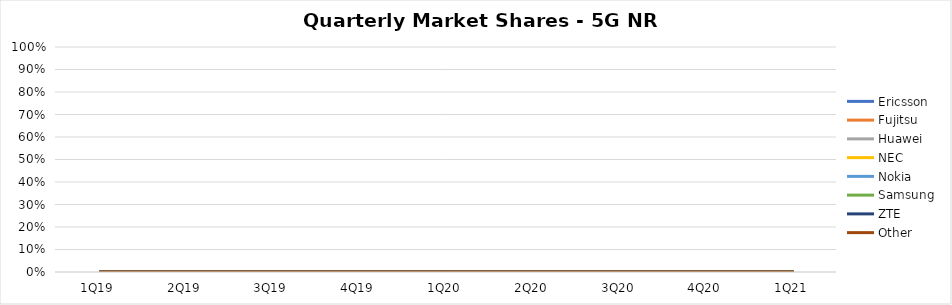
| Category | Ericsson | Fujitsu | Huawei | NEC | Nokia | Samsung | ZTE | Other |
|---|---|---|---|---|---|---|---|---|
| 1Q19 | 0 | 0 | 0 | 0 | 0 | 0 | 0 | 0 |
| 2Q19 | 0 | 0 | 0 | 0 | 0 | 0 | 0 | 0 |
| 3Q19 | 0 | 0 | 0 | 0 | 0 | 0 | 0 | 0 |
| 4Q19 | 0 | 0 | 0 | 0 | 0 | 0 | 0 | 0 |
| 1Q20 | 0 | 0 | 0 | 0 | 0 | 0 | 0 | 0 |
| 2Q20 | 0 | 0 | 0 | 0 | 0 | 0 | 0 | 0 |
| 3Q20 | 0 | 0 | 0 | 0 | 0 | 0 | 0 | 0 |
| 4Q20 | 0 | 0 | 0 | 0 | 0 | 0 | 0 | 0 |
| 1Q21 | 0 | 0 | 0 | 0 | 0 | 0 | 0 | 0 |